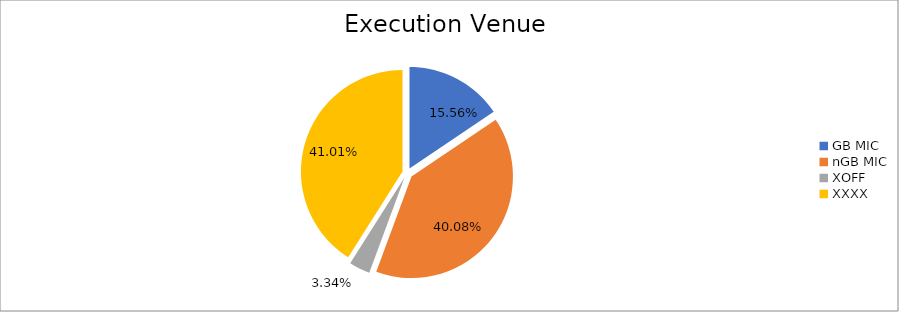
| Category | Series 0 |
|---|---|
| GB MIC | 1913535.749 |
| nGB MIC | 4929269.263 |
| XOFF | 411323.556 |
| XXXX | 5044012.096 |